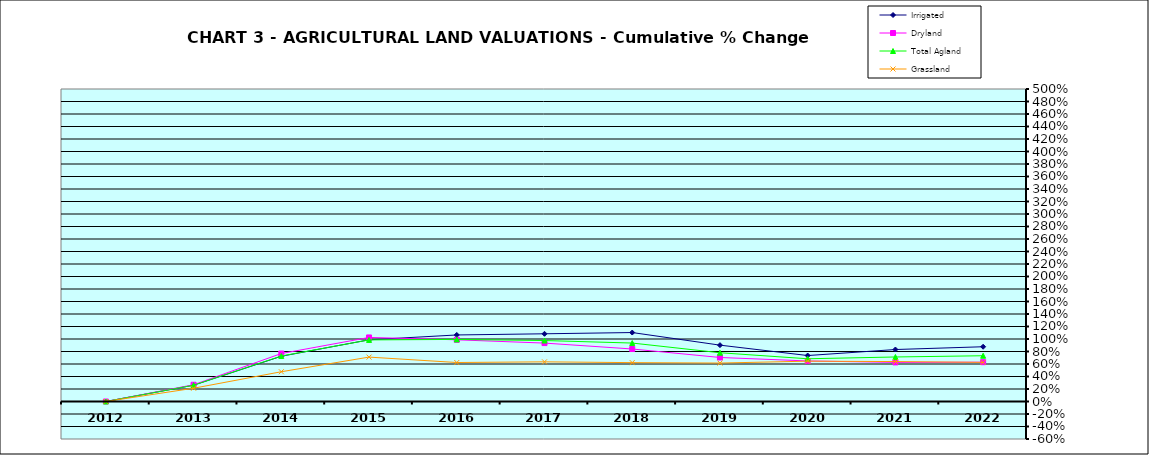
| Category | Irrigated | Dryland | Total Agland | Grassland |
|---|---|---|---|---|
| 2012.0 | 0 | 0 | 0 | 0 |
| 2013.0 | 0.261 | 0.268 | 0.261 | 0.212 |
| 2014.0 | 0.724 | 0.768 | 0.728 | 0.476 |
| 2015.0 | 0.987 | 1.025 | 0.985 | 0.71 |
| 2016.0 | 1.065 | 0.987 | 0.993 | 0.624 |
| 2017.0 | 1.083 | 0.935 | 0.975 | 0.635 |
| 2018.0 | 1.103 | 0.84 | 0.935 | 0.622 |
| 2019.0 | 0.902 | 0.704 | 0.78 | 0.615 |
| 2020.0 | 0.735 | 0.649 | 0.684 | 0.645 |
| 2021.0 | 0.832 | 0.626 | 0.712 | 0.639 |
| 2022.0 | 0.876 | 0.629 | 0.732 | 0.626 |